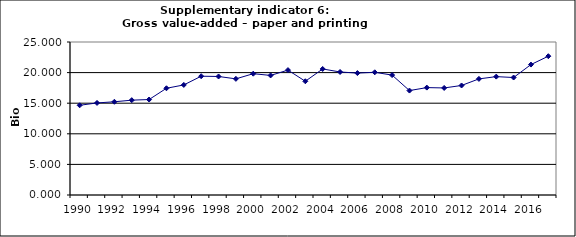
| Category | Gross value-added – paper and printing industry, Bio Euro (EC95) |
|---|---|
| 1990 | 14.658 |
| 1991 | 15.044 |
| 1992 | 15.234 |
| 1993 | 15.495 |
| 1994 | 15.6 |
| 1995 | 17.438 |
| 1996 | 17.986 |
| 1997 | 19.41 |
| 1998 | 19.367 |
| 1999 | 18.978 |
| 2000 | 19.82 |
| 2001 | 19.538 |
| 2002 | 20.408 |
| 2003 | 18.585 |
| 2004 | 20.595 |
| 2005 | 20.102 |
| 2006 | 19.92 |
| 2007 | 20.05 |
| 2008 | 19.59 |
| 2009 | 17.064 |
| 2010 | 17.549 |
| 2011 | 17.492 |
| 2012 | 17.896 |
| 2013 | 18.972 |
| 2014 | 19.343 |
| 2015 | 19.197 |
| 2016 | 21.312 |
| 2017 | 22.682 |